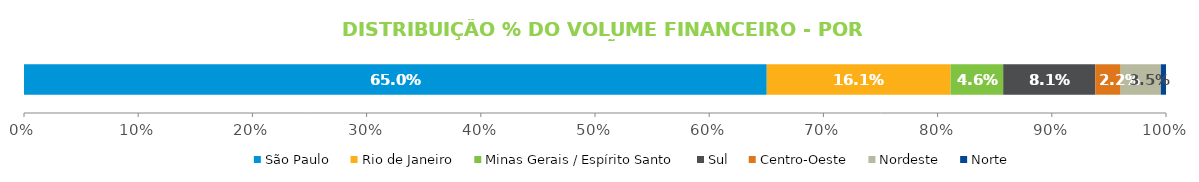
| Category | São Paulo | Rio de Janeiro | Minas Gerais / Espírito Santo | Sul | Centro-Oeste | Nordeste | Norte |
|---|---|---|---|---|---|---|---|
| 0 | 0.65 | 0.161 | 0.046 | 0.081 | 0.022 | 0.035 | 0.005 |